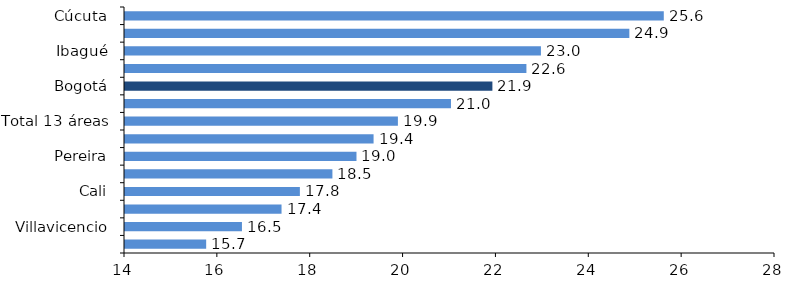
| Category | Series 0 |
|---|---|
| Cúcuta | 25.605 |
| Cartagena | 24.863 |
| Ibagué | 22.959 |
| Montería | 22.646 |
| Bogotá | 21.913 |
| Bucaramanga | 21.021 |
| Total 13 áreas | 19.878 |
| Pasto | 19.354 |
| Pereira | 18.986 |
| Barranquilla | 18.467 |
| Cali | 17.766 |
| Manizales | 17.372 |
| Villavicencio | 16.519 |
| Medellín | 15.748 |